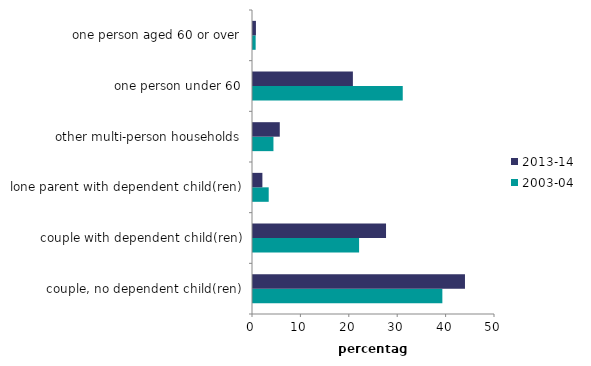
| Category | 2003-04 | 2013-14 |
|---|---|---|
| couple, no dependent child(ren) | 39.123 | 43.797 |
| couple with dependent child(ren) | 21.92 | 27.485 |
| lone parent with dependent child(ren) | 3.245 | 1.941 |
| other multi-person households | 4.225 | 5.533 |
| one person under 60 | 30.939 | 20.639 |
| one person aged 60 or over | 0.548 | 0.606 |